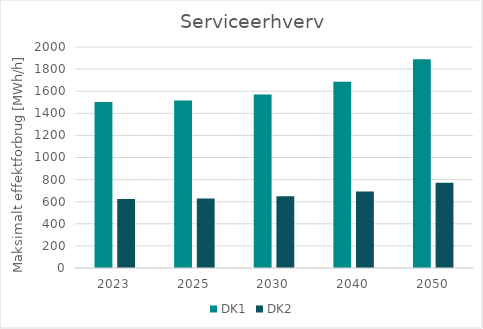
| Category | DK1 | DK2 |
|---|---|---|
| 2023.0 | 1501.254 | 624.015 |
| 2025.0 | 1516.76 | 629.608 |
| 2030.0 | 1570.103 | 648.263 |
| 2040.0 | 1686.217 | 692.928 |
| 2050.0 | 1889.758 | 770.812 |